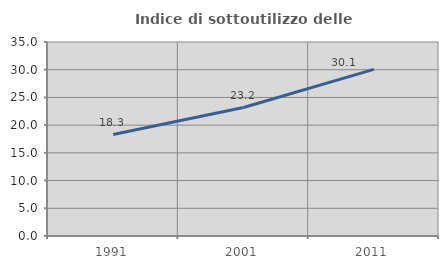
| Category | Indice di sottoutilizzo delle abitazioni  |
|---|---|
| 1991.0 | 18.306 |
| 2001.0 | 23.177 |
| 2011.0 | 30.053 |